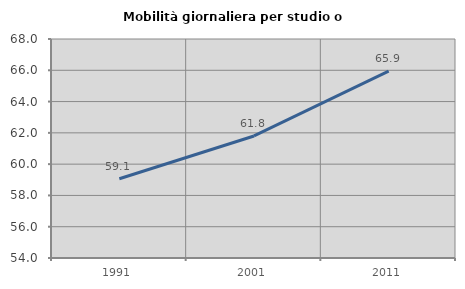
| Category | Mobilità giornaliera per studio o lavoro |
|---|---|
| 1991.0 | 59.064 |
| 2001.0 | 61.802 |
| 2011.0 | 65.942 |